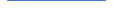
| Category | Series 0 |
|---|---|
| 0 | 34 |
| 1 | 39 |
| 2 | 36 |
| 3 | 21 |
| 4 | 34 |
| 5 | 39 |
| 6 | 33 |
| 7 | 37 |
| 8 | 39 |